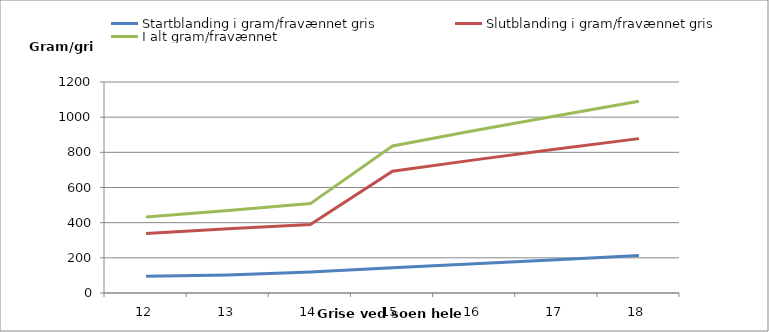
| Category | Startblanding i gram/fravænnet gris | Slutblanding i gram/fravænnet gris | I alt gram/fravænnet |
|---|---|---|---|
| 12.0 | 94.917 | 337.833 | 432.75 |
| 13.0 | 102.827 | 365.986 | 468.813 |
| 14.0 | 118.94 | 389.47 | 508.41 |
| 15.0 | 142.914 | 692.883 | 835.797 |
| 16.0 | 166.502 | 757.131 | 923.634 |
| 17.0 | 189.773 | 818.739 | 1008.512 |
| 18.0 | 212.78 | 877.959 | 1090.739 |